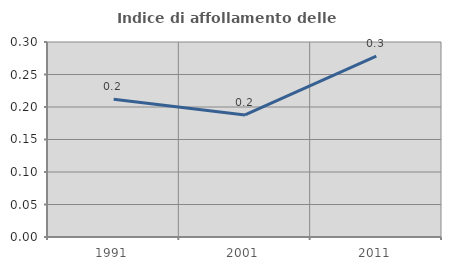
| Category | Indice di affollamento delle abitazioni  |
|---|---|
| 1991.0 | 0.212 |
| 2001.0 | 0.188 |
| 2011.0 | 0.278 |